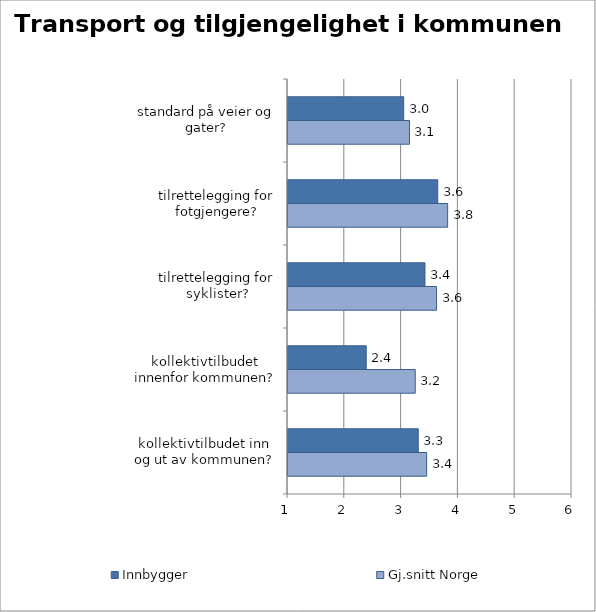
| Category | Innbygger | Gj.snitt Norge |
|---|---|---|
| standard på veier og gater? | 3.037 | 3.139 |
| tilrettelegging for fotgjengere? | 3.636 | 3.81 |
| tilrettelegging for syklister? | 3.412 | 3.616 |
| kollektivtilbudet innenfor kommunen? | 2.378 | 3.24 |
| kollektivtilbudet inn og ut av kommunen? | 3.293 | 3.441 |